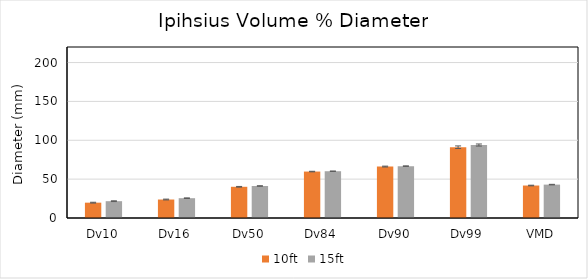
| Category | 10ft | 15ft |
|---|---|---|
| Dv10 | 19.732 | 21.64 |
| Dv16 | 23.774 | 25.49 |
| Dv50 | 40.148 | 41.18 |
| Dv84 | 59.748 | 60.184 |
| Dv90 | 66.18 | 66.716 |
| Dv99 | 91.082 | 93.878 |
| VMD | 41.774 | 42.96 |